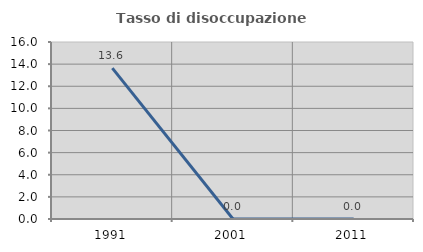
| Category | Tasso di disoccupazione giovanile  |
|---|---|
| 1991.0 | 13.636 |
| 2001.0 | 0 |
| 2011.0 | 0 |